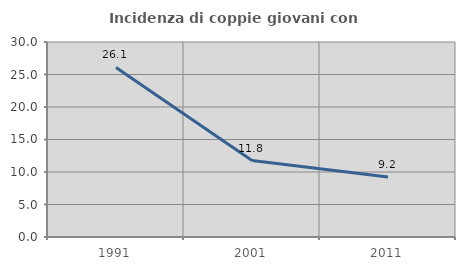
| Category | Incidenza di coppie giovani con figli |
|---|---|
| 1991.0 | 26.087 |
| 2001.0 | 11.765 |
| 2011.0 | 9.231 |